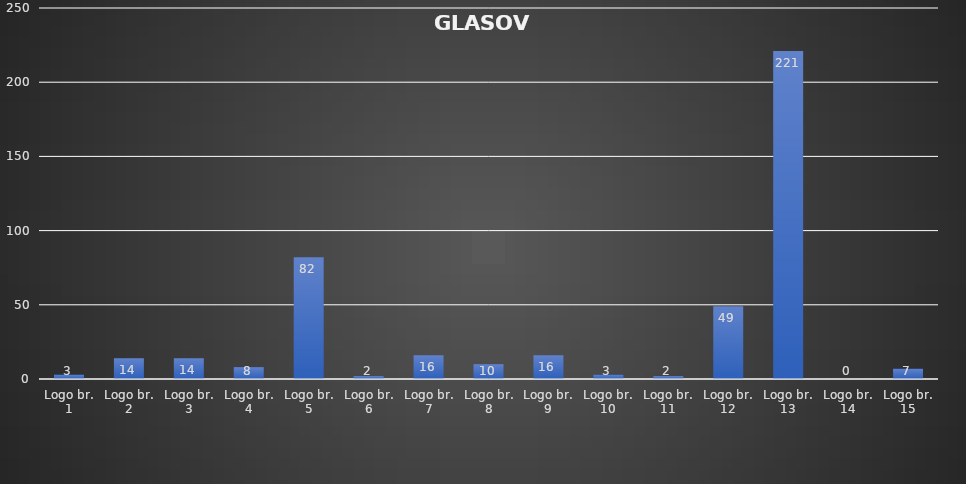
| Category | GLASOVI |
|---|---|
| Logo br. 1 | 3 |
| Logo br. 2 | 14 |
| Logo br. 3 | 14 |
| Logo br. 4 | 8 |
| Logo br. 5 | 82 |
| Logo br. 6 | 2 |
| Logo br. 7 | 16 |
| Logo br. 8 | 10 |
| Logo br. 9 | 16 |
| Logo br. 10 | 3 |
| Logo br. 11 | 2 |
| Logo br. 12 | 49 |
| Logo br. 13 | 221 |
| Logo br. 14 | 0 |
| Logo br. 15 | 7 |